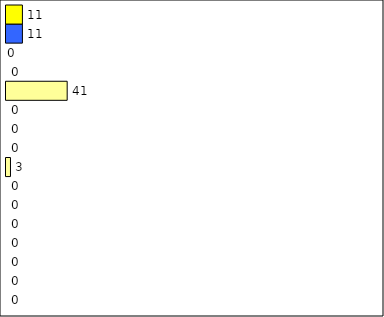
| Category | -2 | -1 | 0 | 1 | 2 | 3 | 4 | 5 | 6 | 7 | 8 | 9 | 10 | 11 | 12 | Perfect Round |
|---|---|---|---|---|---|---|---|---|---|---|---|---|---|---|---|---|
| 0 | 0 | 0 | 0 | 0 | 0 | 0 | 0 | 3 | 0 | 0 | 0 | 41 | 0 | 0 | 11 | 11 |